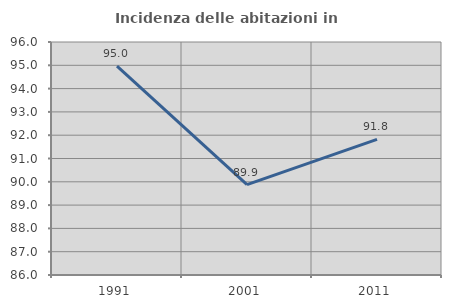
| Category | Incidenza delle abitazioni in proprietà  |
|---|---|
| 1991.0 | 94.966 |
| 2001.0 | 89.877 |
| 2011.0 | 91.824 |